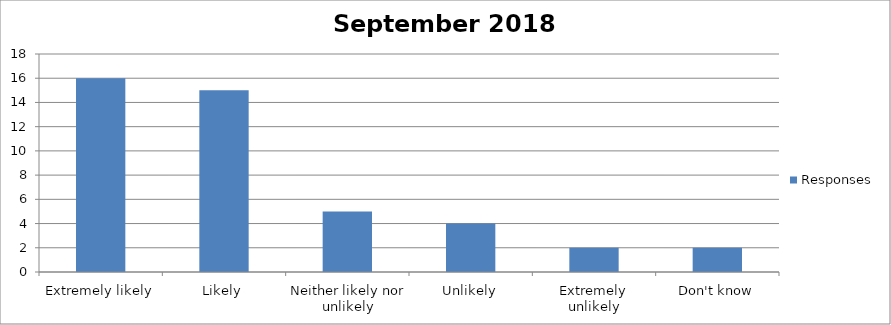
| Category | Responses |
|---|---|
| Extremely likely | 16 |
| Likely | 15 |
| Neither likely nor unlikely | 5 |
| Unlikely | 4 |
| Extremely unlikely | 2 |
| Don't know | 2 |